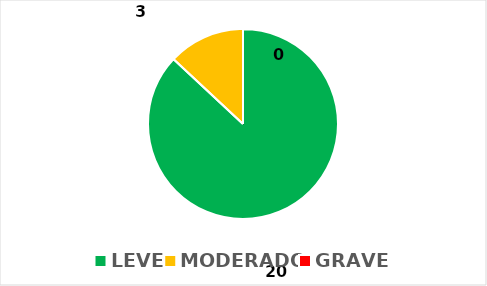
| Category | Series 0 |
|---|---|
| LEVE | 20 |
| MODERADO | 3 |
| GRAVE | 0 |